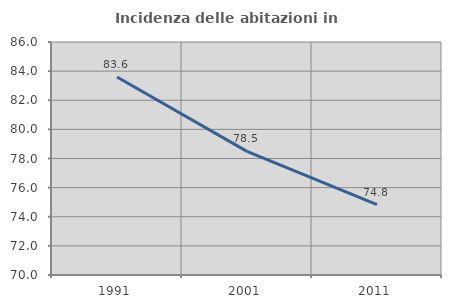
| Category | Incidenza delle abitazioni in proprietà  |
|---|---|
| 1991.0 | 83.6 |
| 2001.0 | 78.491 |
| 2011.0 | 74.837 |